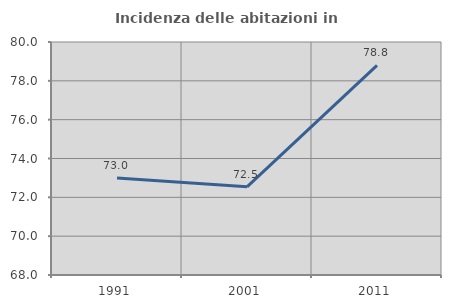
| Category | Incidenza delle abitazioni in proprietà  |
|---|---|
| 1991.0 | 72.995 |
| 2001.0 | 72.539 |
| 2011.0 | 78.797 |